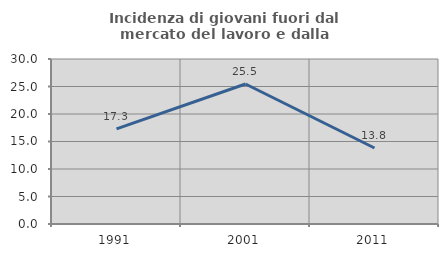
| Category | Incidenza di giovani fuori dal mercato del lavoro e dalla formazione  |
|---|---|
| 1991.0 | 17.288 |
| 2001.0 | 25.455 |
| 2011.0 | 13.821 |